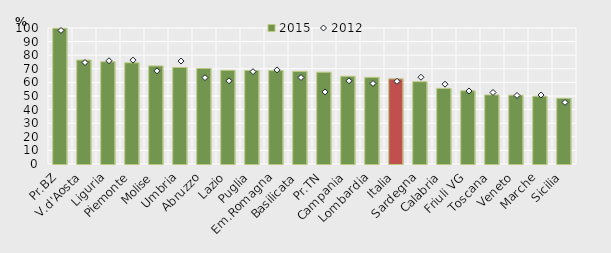
| Category | 2015 |
|---|---|
| Pr.BZ | 99.8 |
| V.d'Aosta | 76.4 |
| Liguria | 75.2 |
| Piemonte | 74.4 |
| Molise | 72.1 |
| Umbria | 71 |
| Abruzzo | 70.2 |
| Lazio | 68.9 |
| Puglia | 68.8 |
| Em.Romagna | 68.7 |
| Basilicata | 68.1 |
| Pr.TN | 67.5 |
| Campania | 64.5 |
| Lombardia | 63.7 |
| Italia | 62.6 |
| Sardegna | 60.5 |
| Calabria | 55.6 |
| Friuli VG | 53.8 |
| Toscana | 50.8 |
| Veneto | 50.6 |
| Marche | 49.8 |
| Sicilia | 48.3 |